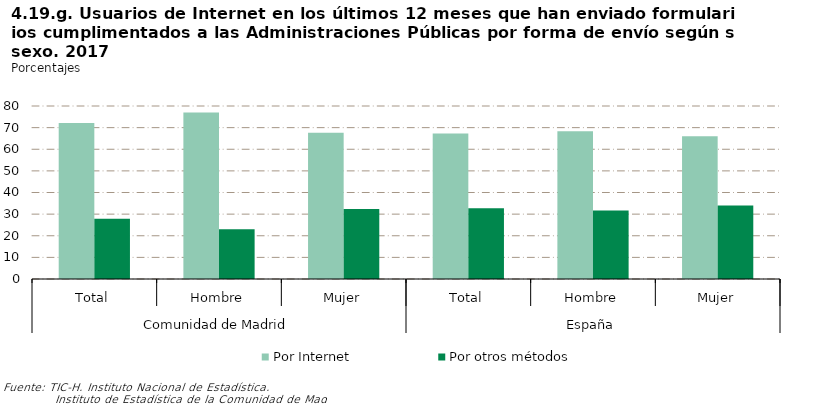
| Category | Por Internet | Por otros métodos |
|---|---|---|
| 0 | 72.189 | 27.811 |
| 1 | 76.945 | 23.055 |
| 2 | 67.619 | 32.381 |
| 3 | 67.245 | 32.755 |
| 4 | 68.352 | 31.648 |
| 5 | 66.056 | 33.944 |